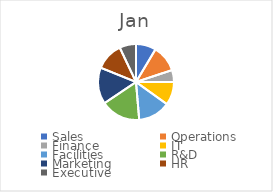
| Category | Jan |
|---|---|
| Sales | 22846 |
| Operations | 30249 |
| Finance | 13703 |
| IT | 26274 |
| Facilities | 36648 |
| R&D | 45158 |
| Marketing | 41433 |
| HR | 31618 |
| Executive | 18746 |